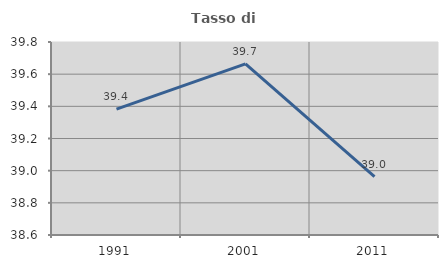
| Category | Tasso di occupazione   |
|---|---|
| 1991.0 | 39.383 |
| 2001.0 | 39.664 |
| 2011.0 | 38.962 |